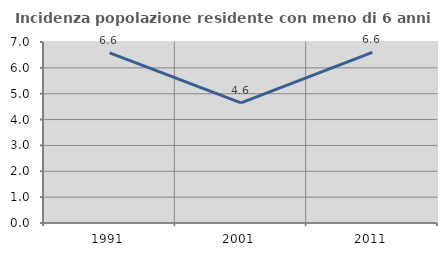
| Category | Incidenza popolazione residente con meno di 6 anni |
|---|---|
| 1991.0 | 6.579 |
| 2001.0 | 4.645 |
| 2011.0 | 6.598 |